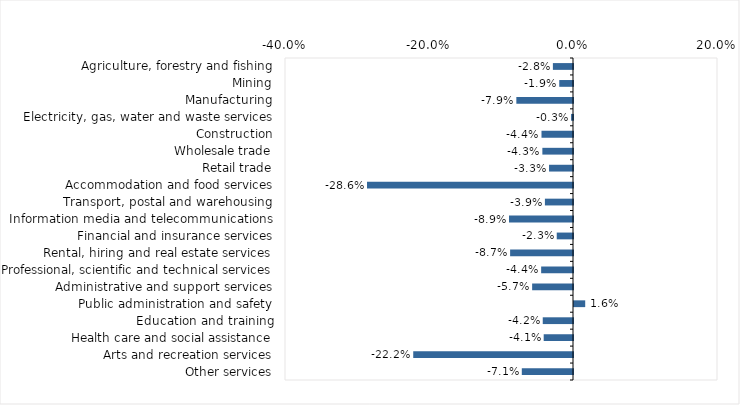
| Category | This week |
|---|---|
| Agriculture, forestry and fishing | -0.028 |
| Mining | -0.019 |
| Manufacturing | -0.079 |
| Electricity, gas, water and waste services | -0.003 |
| Construction | -0.044 |
| Wholesale trade | -0.043 |
| Retail trade | -0.033 |
| Accommodation and food services | -0.286 |
| Transport, postal and warehousing | -0.039 |
| Information media and telecommunications | -0.089 |
| Financial and insurance services | -0.023 |
| Rental, hiring and real estate services | -0.087 |
| Professional, scientific and technical services | -0.044 |
| Administrative and support services | -0.057 |
| Public administration and safety | 0.016 |
| Education and training | -0.042 |
| Health care and social assistance | -0.041 |
| Arts and recreation services | -0.222 |
| Other services | -0.071 |